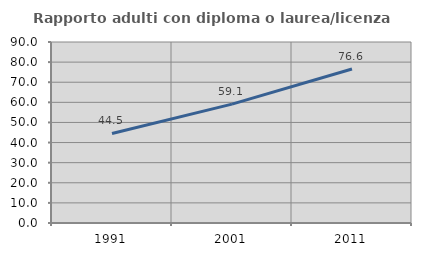
| Category | Rapporto adulti con diploma o laurea/licenza media  |
|---|---|
| 1991.0 | 44.507 |
| 2001.0 | 59.118 |
| 2011.0 | 76.596 |